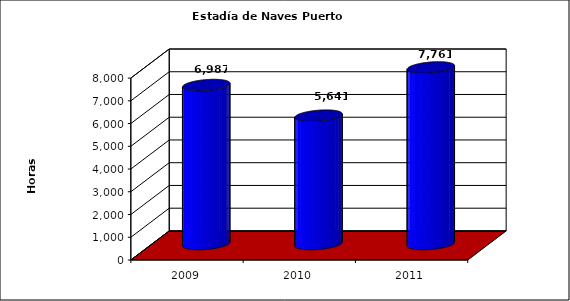
| Category | Series 0 |
|---|---|
| 2009.0 | 6987 |
| 2010.0 | 5641.32 |
| 2011.0 | 7761.25 |